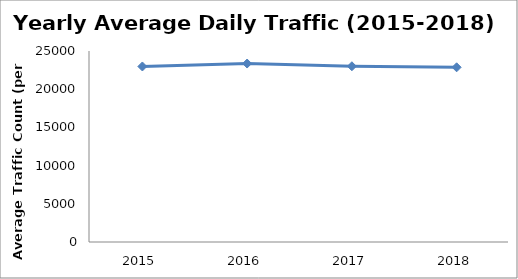
| Category | Series 0 |
|---|---|
| 2015.0 | 22973.507 |
| 2016.0 | 23359.279 |
| 2017.0 | 23002.304 |
| 2018.0 | 22865.704 |